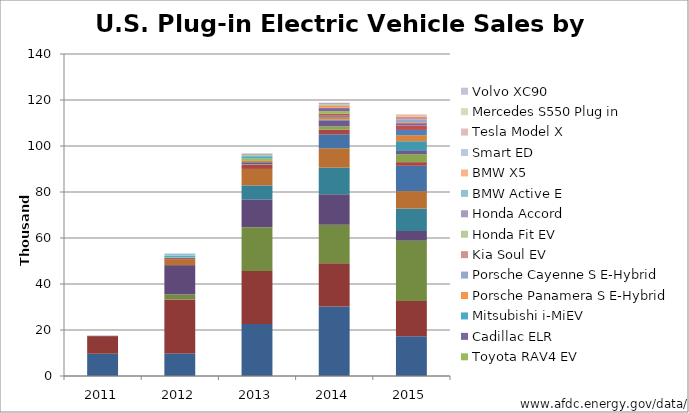
| Category | Nissan LEAF | Chevrolet Volt PHEV | Tesla Model S | Toyota Prius Plug-in | Ford Fusion Energi | Ford C-MAX Energi PHEV | BMW i3 | Ford Focus EV | Fiat 500E | Smart for Two EV | VW e-Golf | Chevrolet Spark | BMW i8 | Mercedes B-Class Electric | Toyota RAV4 EV | Cadillac ELR | Mitsubishi i-MiEV | Porsche Panamera S E-Hybrid | Porsche Cayenne S E-Hybrid | Kia Soul EV | Honda Fit EV | Honda Accord | BMW Active E | BMW X5 | Smart ED | Tesla Model X | Mercedes S550 Plug in | Volvo XC90 |
|---|---|---|---|---|---|---|---|---|---|---|---|---|---|---|---|---|---|---|---|---|---|---|---|---|---|---|---|---|
| 2011.0 | 9674 | 7671 | 0 | 0 | 0 | 0 | 0 | 0 | 0 | 0 | 0 | 0 | 0 | 0 | 0 | 0 | 76 | 0 | 0 | 0 | 0 | 0 | 0 | 0 | 310 | 0 | 0 | 0 |
| 2012.0 | 9819 | 23461 | 2171 | 12749 | 0 | 2374 | 0 | 683 | 0 | 137 | 0 | 0 | 0 | 0 | 192 | 0 | 588 | 0 | 0 | 0 | 93 | 0 | 965 | 0 | 2 | 0 | 0 | 0 |
| 2013.0 | 22610 | 23094 | 19000 | 12088 | 6089 | 7154 | 0 | 1738 | 260 | 923 | 0 | 560 | 0 | 0 | 1005 | 6 | 1029 | 51 | 0 | 0 | 569 | 526 | 0 | 0 | 0 | 0 | 0 | 0 |
| 2014.0 | 30200 | 18805 | 16750 | 13264 | 11550 | 8433 | 6092 | 1964 | 1503 | 2594 | 357 | 1145 | 555 | 774 | 1184 | 1310 | 196 | 879 | 112 | 250 | 407 | 449 | 0 | 0 | 0 | 0 | 0 | 0 |
| 2015.0 | 17269 | 15393 | 26200 | 4191 | 9750 | 7591 | 11004 | 1582 | 3477 | 1387 | 4232 | 2629 | 2265 | 1906 | 18 | 1024 | 115 | 407 | 1163 | 1015 | 2 | 63 | 0 | 774 | 0 | 208 | 118 | 86 |